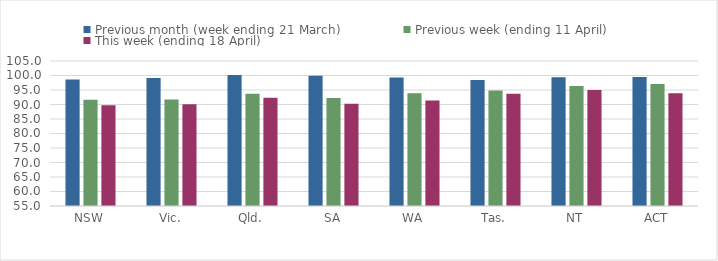
| Category | Previous month (week ending 21 March) | Previous week (ending 11 April) | This week (ending 18 April) |
|---|---|---|---|
| NSW | 98.59 | 91.637 | 89.756 |
| Vic. | 99.156 | 91.701 | 90.12 |
| Qld. | 100.171 | 93.719 | 92.305 |
| SA | 99.879 | 92.201 | 90.252 |
| WA | 99.278 | 93.907 | 91.365 |
| Tas. | 98.431 | 94.852 | 93.687 |
| NT | 99.402 | 96.411 | 94.97 |
| ACT | 99.492 | 97.081 | 93.868 |